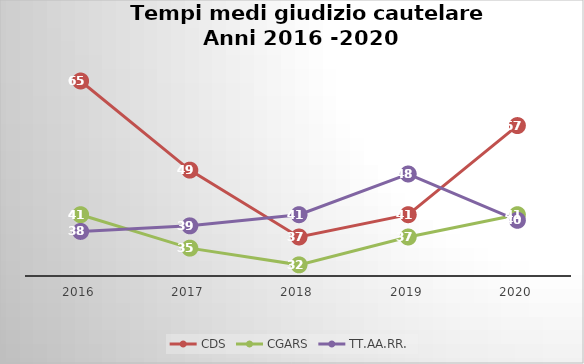
| Category | CDS | CGARS | TT.AA.RR. |
|---|---|---|---|
| 2016.0 | 65 | 41 | 38 |
| 2017.0 | 49 | 35 | 39 |
| 2018.0 | 37 | 32 | 41 |
| 2019.0 | 41 | 37 | 48.307 |
| 2020.0 | 57 | 41 | 40 |